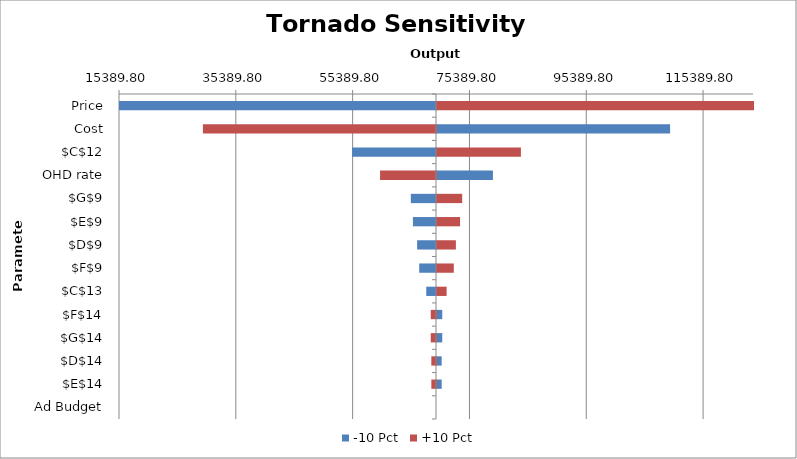
| Category | -10 Pct | +10 Pct |
|---|---|---|
| Price | 15389.753 | 123934.454 |
| Cost | 109568.243 | 29755.964 |
| $C$12 | 55295.893 | 84028.314 |
| OHD rate | 79239.577 | 60084.63 |
| $G$9 | 65352.24 | 73971.967 |
| $E$9 | 65711.396 | 73612.811 |
| $D$9 | 66429.706 | 72894.501 |
| $F$9 | 66788.862 | 72535.346 |
| $C$13 | 67994.789 | 71310.289 |
| $F$14 | 70562.104 | 68762.104 |
| $G$14 | 70562.104 | 68762.104 |
| $D$14 | 70462.104 | 68862.104 |
| $E$14 | 70462.104 | 68862.104 |
| Ad Budget | 69662.104 | 69662.104 |